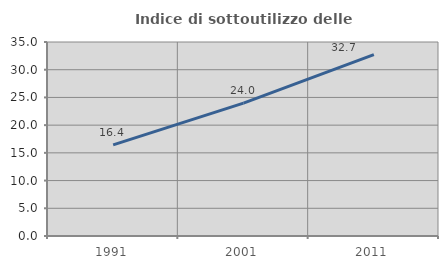
| Category | Indice di sottoutilizzo delle abitazioni  |
|---|---|
| 1991.0 | 16.434 |
| 2001.0 | 23.977 |
| 2011.0 | 32.728 |